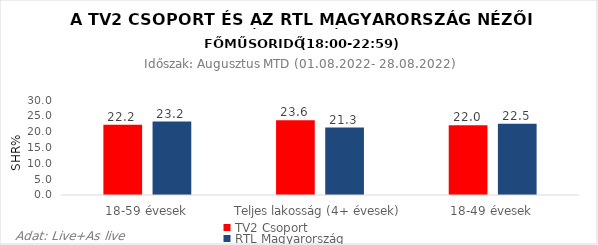
| Category | TV2 Csoport | RTL Magyarország |
|---|---|---|
| 18-59 évesek | 22.2 | 23.2 |
| Teljes lakosság (4+ évesek) | 23.6 | 21.3 |
| 18-49 évesek | 22 | 22.5 |